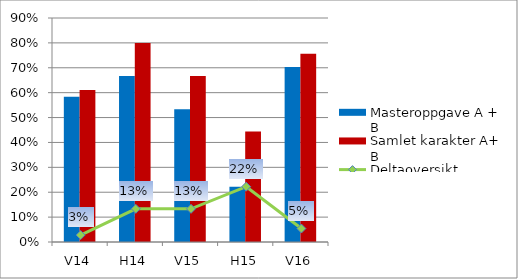
| Category | Masteroppgave A + B | Samlet karakter A+ B |
|---|---|---|
| V14 | 0.583 | 0.611 |
| H14 | 0.667 | 0.8 |
| V15 | 0.533 | 0.667 |
| H15 | 0.222 | 0.444 |
| V16 | 0.703 | 0.757 |